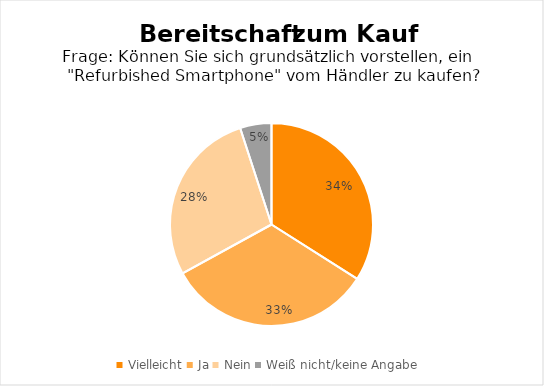
| Category | Series 0 |
|---|---|
| Vielleicht | 0.34 |
| Ja | 0.33 |
| Nein | 0.28 |
| Weiß nicht/keine Angabe | 0.05 |